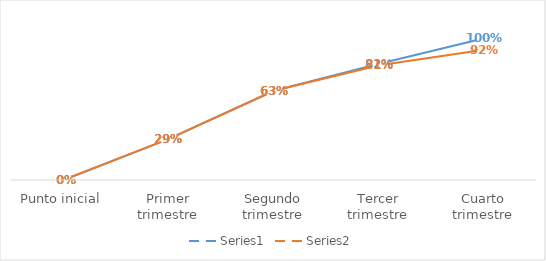
| Category | Series 0 | Series 1 |
|---|---|---|
| Punto inicial | 0 | 0 |
| Primer trimestre | 0.29 | 0.29 |
| Segundo trimestre | 0.63 | 0.63 |
| Tercer trimestre | 0.82 | 0.81 |
| Cuarto trimestre | 1 | 0.92 |